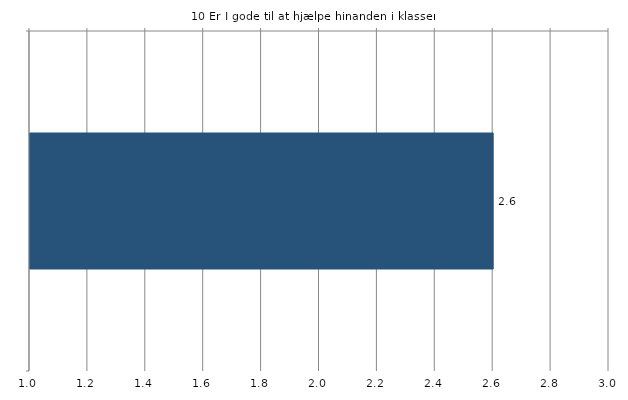
| Category | Gns. |
|---|---|
|    | 2.6 |